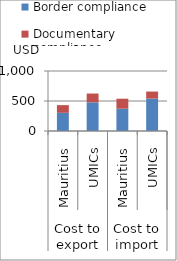
| Category | Border compliance | Documentary compliance |
|---|---|---|
| 0 | 303 | 128 |
| 1 | 477.44 | 147.02 |
| 2 | 372 | 166 |
| 3 | 539.94 | 117.26 |